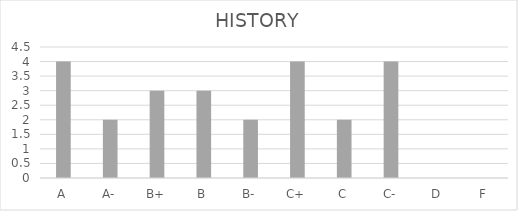
| Category | HISTORY |
|---|---|
| A | 4 |
| A- | 2 |
| B+ | 3 |
| B | 3 |
| B- | 2 |
| C+ | 4 |
| C | 2 |
| C- | 4 |
| D | 0 |
| F | 0 |